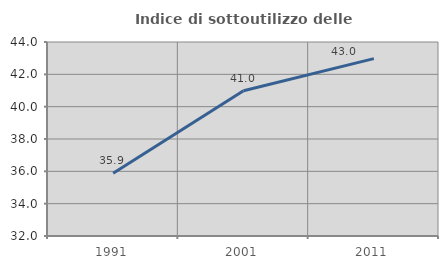
| Category | Indice di sottoutilizzo delle abitazioni  |
|---|---|
| 1991.0 | 35.879 |
| 2001.0 | 40.985 |
| 2011.0 | 42.972 |